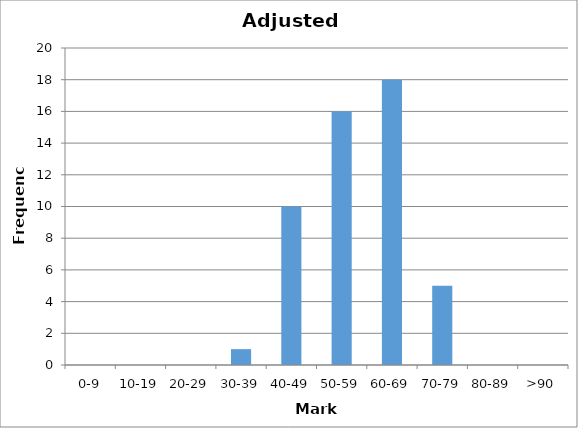
| Category | Series 0 |
|---|---|
| 0-9 | 0 |
| 10-19 | 0 |
| 20-29 | 0 |
| 30-39 | 1 |
| 40-49 | 10 |
| 50-59 | 16 |
| 60-69 | 18 |
| 70-79 | 5 |
| 80-89 | 0 |
| >90 | 0 |